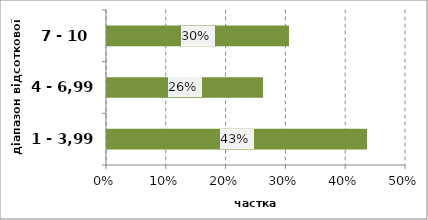
| Category | Series 0 |
|---|---|
| 1 - 3,99 | 0.435 |
| 4 - 6,99 | 0.261 |
| 7 - 10 | 0.304 |